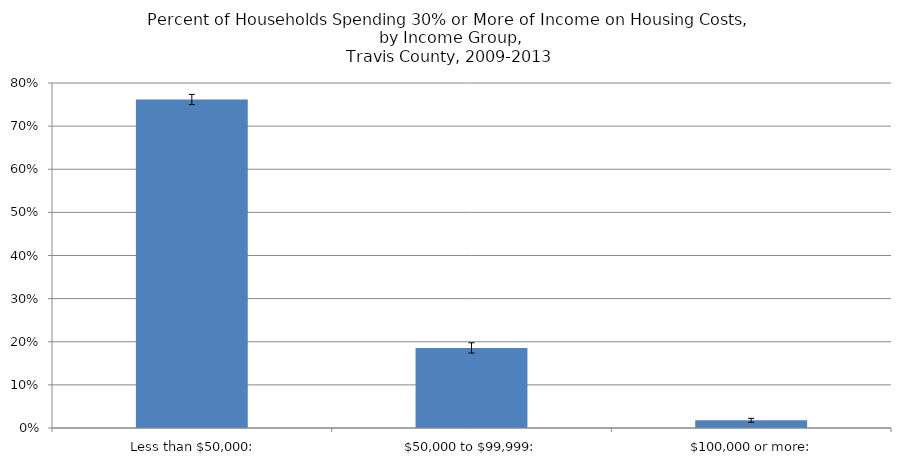
| Category | % Cost-Burdened |
|---|---|
|   Less than $50,000: | 0.762 |
|   $50,000 to $99,999: | 0.186 |
|   $100,000 or more: | 0.018 |